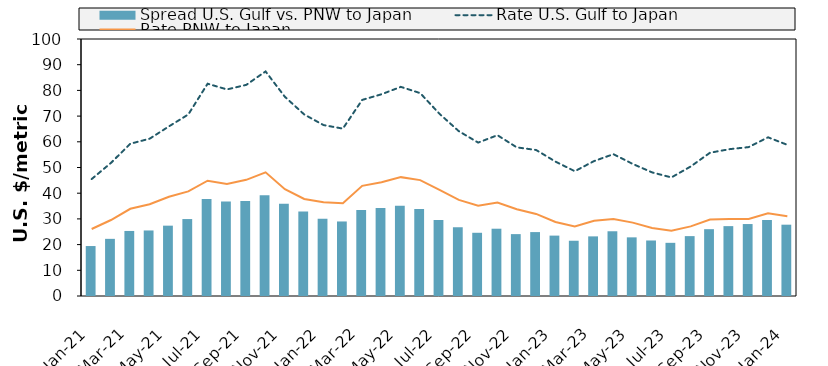
| Category | Spread |
|---|---|
| 2021-01-01 | 19.44 |
| 2021-02-01 | 22.24 |
| 2021-03-01 | 25.31 |
| 2021-04-01 | 25.5 |
| 2021-05-01 | 27.37 |
| 2021-06-01 | 29.94 |
| 2021-07-01 | 37.75 |
| 2021-08-01 | 36.75 |
| 2021-09-01 | 36.95 |
| 2021-10-01 | 39.25 |
| 2021-11-01 | 35.92 |
| 2021-12-01 | 32.88 |
| 2022-01-01 | 30.06 |
| 2022-02-01 | 29 |
| 2022-03-01 | 33.45 |
| 2022-04-01 | 34.25 |
| 2022-05-01 | 35.13 |
| 2022-06-01 | 33.85 |
| 2022-07-01 | 29.57 |
| 2022-08-01 | 26.75 |
| 2022-09-01 | 24.6 |
| 2022-10-01 | 26.18 |
| 2022-11-01 | 24.08 |
| 2022-12-01 | 24.87 |
| 2023-01-01 | 23.5 |
| 2023-02-01 | 21.5 |
| 2023-03-01 | 23.2 |
| 2023-04-01 | 25.19 |
| 2023-05-01 | 22.82 |
| 2023-06-01 | 21.6 |
| 2023-07-01 | 20.69 |
| 2023-08-01 | 23.3 |
| 2023-09-01 | 26 |
| 2023-10-01 | 27.188 |
| 2023-11-01 | 28 |
| 2023-12-01 | 29.58 |
| 2024-01-01 | 27.75 |